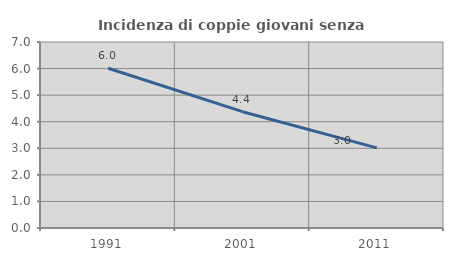
| Category | Incidenza di coppie giovani senza figli |
|---|---|
| 1991.0 | 6.012 |
| 2001.0 | 4.377 |
| 2011.0 | 3.014 |